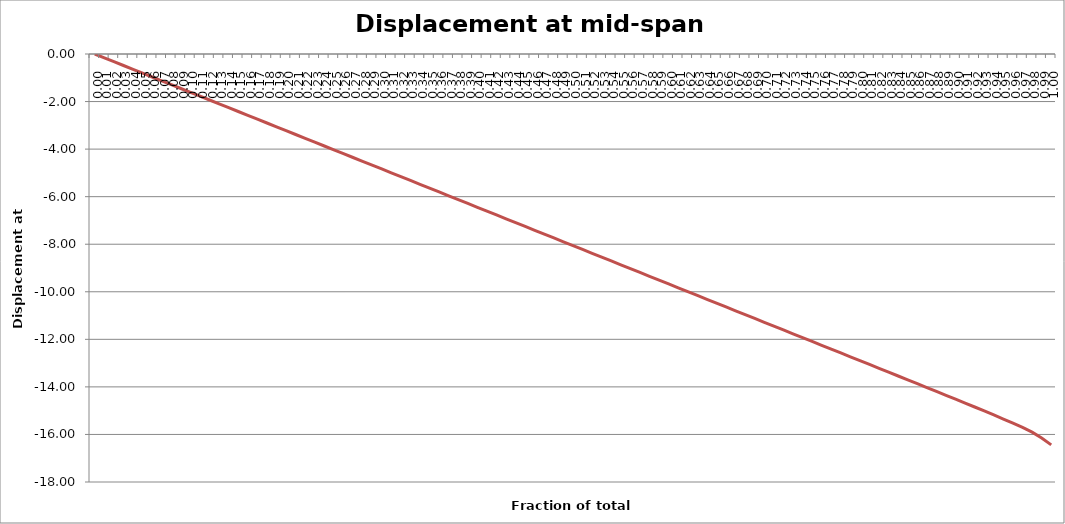
| Category | Displacement at mid-span [mm] |
|---|---|
| 0.0 | 0 |
| 0.01 | -0.161 |
| 0.02 | -0.322 |
| 0.03 | -0.484 |
| 0.04 | -0.645 |
| 0.05 | -0.806 |
| 0.06 | -0.967 |
| 0.06999999999999999 | -1.128 |
| 0.08 | -1.29 |
| 0.09 | -1.451 |
| 0.1 | -1.612 |
| 0.11000000000000001 | -1.773 |
| 0.12 | -1.934 |
| 0.13 | -2.096 |
| 0.13999999999999999 | -2.257 |
| 0.15 | -2.418 |
| 0.16 | -2.579 |
| 0.16999999999999998 | -2.74 |
| 0.18 | -2.901 |
| 0.19 | -3.063 |
| 0.2 | -3.224 |
| 0.21000000000000002 | -3.385 |
| 0.22000000000000003 | -3.546 |
| 0.22999999999999998 | -3.707 |
| 0.24 | -3.869 |
| 0.25 | -4.03 |
| 0.26 | -4.191 |
| 0.27 | -4.352 |
| 0.27999999999999997 | -4.513 |
| 0.29 | -4.674 |
| 0.3 | -4.836 |
| 0.31 | -4.997 |
| 0.32 | -5.158 |
| 0.32999999999999996 | -5.319 |
| 0.33999999999999997 | -5.48 |
| 0.35 | -5.642 |
| 0.36 | -5.803 |
| 0.37 | -5.964 |
| 0.38 | -6.125 |
| 0.39 | -6.286 |
| 0.4 | -6.448 |
| 0.41 | -6.609 |
| 0.42000000000000004 | -6.77 |
| 0.43 | -6.931 |
| 0.44000000000000006 | -7.092 |
| 0.45 | -7.254 |
| 0.45999999999999996 | -7.415 |
| 0.47000000000000003 | -7.576 |
| 0.48 | -7.737 |
| 0.49000000000000005 | -7.898 |
| 0.5 | -8.06 |
| 0.51 | -8.221 |
| 0.52 | -8.382 |
| 0.53 | -8.543 |
| 0.54 | -8.704 |
| 0.55 | -8.865 |
| 0.5599999999999999 | -9.027 |
| 0.5700000000000001 | -9.188 |
| 0.58 | -9.349 |
| 0.5900000000000001 | -9.51 |
| 0.6 | -9.671 |
| 0.61 | -9.833 |
| 0.62 | -9.994 |
| 0.63 | -10.155 |
| 0.64 | -10.316 |
| 0.65 | -10.477 |
| 0.6599999999999999 | -10.639 |
| 0.67 | -10.8 |
| 0.6799999999999999 | -10.961 |
| 0.6900000000000001 | -11.122 |
| 0.7 | -11.283 |
| 0.71 | -11.444 |
| 0.72 | -11.606 |
| 0.73 | -11.767 |
| 0.74 | -11.928 |
| 0.75 | -12.089 |
| 0.76 | -12.25 |
| 0.77 | -12.412 |
| 0.78 | -12.573 |
| 0.79 | -12.734 |
| 0.8 | -12.896 |
| 0.8099999999999999 | -13.057 |
| 0.82 | -13.218 |
| 0.8300000000000001 | -13.38 |
| 0.8400000000000001 | -13.542 |
| 0.85 | -13.703 |
| 0.86 | -13.865 |
| 0.8699999999999999 | -14.027 |
| 0.8800000000000001 | -14.19 |
| 0.89 | -14.353 |
| 0.9 | -14.517 |
| 0.9099999999999999 | -14.681 |
| 0.9199999999999999 | -14.846 |
| 0.93 | -15.013 |
| 0.9400000000000001 | -15.181 |
| 0.95 | -15.351 |
| 0.96 | -15.525 |
| 0.97 | -15.705 |
| 0.9800000000000001 | -15.903 |
| 0.99 | -16.15 |
| 1.0 | -16.44 |